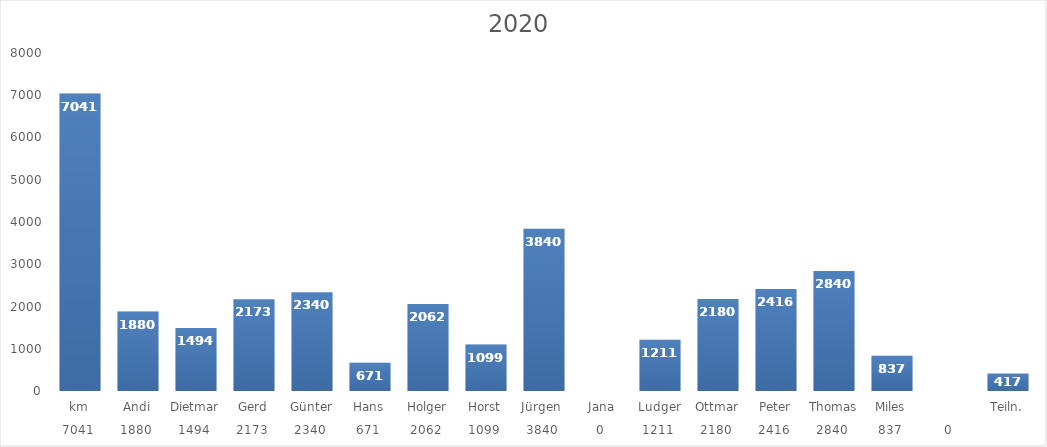
| Category | 2019 |
|---|---|
| 0 | 7041 |
| 1 | 1880 |
| 2 | 1494 |
| 3 | 2173 |
| 4 | 2340 |
| 5 | 671 |
| 6 | 2062 |
| 7 | 1099 |
| 8 | 3840 |
| 9 | 0 |
| 10 | 1211 |
| 11 | 2180 |
| 12 | 2416 |
| 13 | 2840 |
| 14 | 837 |
| 15 | 0 |
| 16 | 417 |